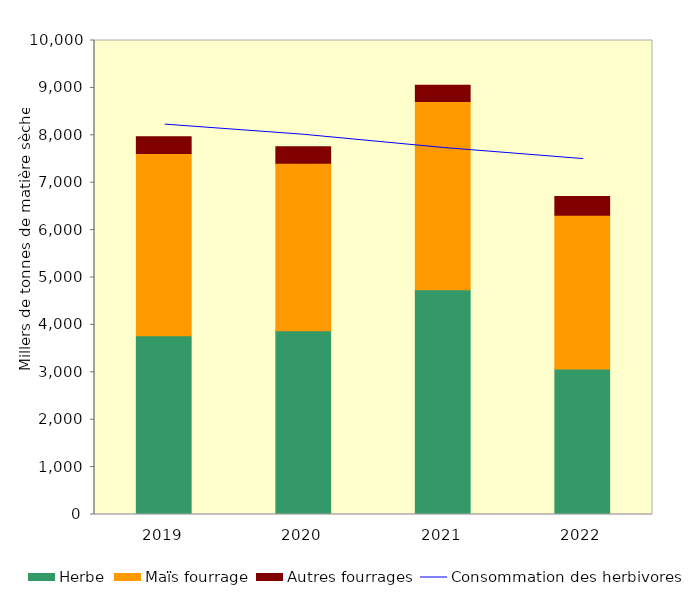
| Category | Herbe | Maïs fourrage | Autres fourrages |
|---|---|---|---|
| 2019.0 | 3771 | 3843 | 357 |
| 2020.0 | 3874 | 3534 | 349 |
| 2021.0 | 4742 | 3969 | 346 |
| 2022.0 | 3071 | 3242 | 396 |